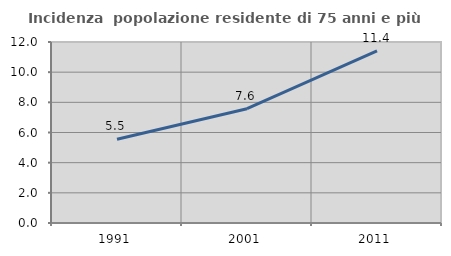
| Category | Incidenza  popolazione residente di 75 anni e più |
|---|---|
| 1991.0 | 5.548 |
| 2001.0 | 7.577 |
| 2011.0 | 11.404 |